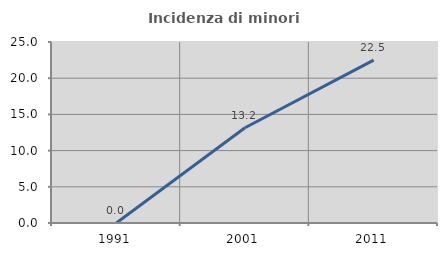
| Category | Incidenza di minori stranieri |
|---|---|
| 1991.0 | 0 |
| 2001.0 | 13.158 |
| 2011.0 | 22.5 |